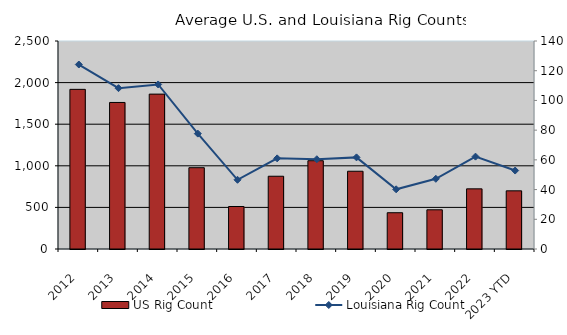
| Category | US Rig Count |
|---|---|
| 2012 | 1918.833 |
| 2013 | 1761.25 |
| 2014 | 1861.5 |
| 2015 | 977.25 |
| 2016 | 510.667 |
| 2017 | 874.5 |
| 2018 | 1061.167 |
| 2019 | 934.583 |
| 2020 | 435.917 |
| 2021 | 471.25 |
| 2022 | 722.917 |
| 2023 YTD | 699 |